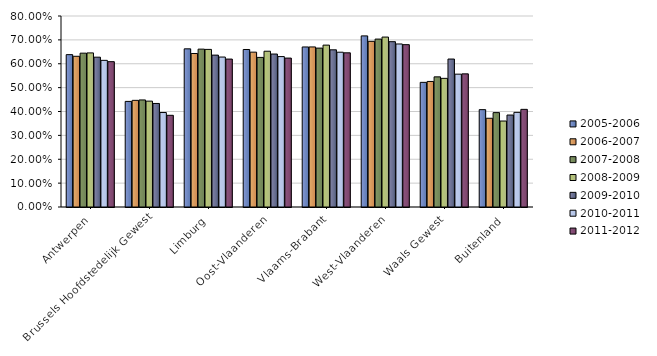
| Category | 2005-2006 | 2006-2007 | 2007-2008 | 2008-2009 | 2009-2010 | 2010-2011 | 2011-2012 |
|---|---|---|---|---|---|---|---|
| Antwerpen | 0.638 | 0.631 | 0.644 | 0.645 | 0.628 | 0.614 | 0.609 |
| Brussels Hoofdstedelijk Gewest | 0.442 | 0.447 | 0.448 | 0.443 | 0.434 | 0.396 | 0.384 |
| Limburg | 0.662 | 0.643 | 0.661 | 0.66 | 0.636 | 0.628 | 0.62 |
| Oost-Vlaanderen | 0.66 | 0.649 | 0.627 | 0.652 | 0.641 | 0.63 | 0.624 |
| Vlaams-Brabant | 0.67 | 0.67 | 0.666 | 0.678 | 0.658 | 0.648 | 0.646 |
| West-Vlaanderen | 0.717 | 0.694 | 0.703 | 0.712 | 0.692 | 0.683 | 0.68 |
| Waals Gewest | 0.522 | 0.526 | 0.545 | 0.539 | 0.62 | 0.556 | 0.558 |
| Buitenland | 0.408 | 0.372 | 0.395 | 0.36 | 0.385 | 0.396 | 0.409 |